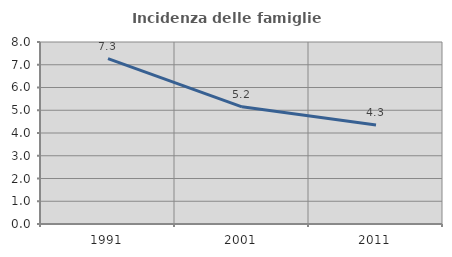
| Category | Incidenza delle famiglie numerose |
|---|---|
| 1991.0 | 7.273 |
| 2001.0 | 5.15 |
| 2011.0 | 4.348 |